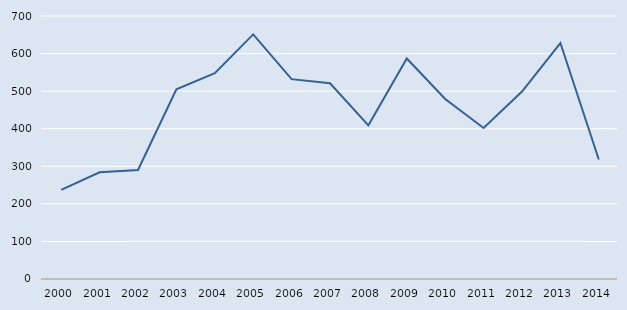
| Category | Series 0 |
|---|---|
| 2000.0 | 237 |
| 2001.0 | 284 |
| 2002.0 | 290 |
| 2003.0 | 505 |
| 2004.0 | 548 |
| 2005.0 | 651 |
| 2006.0 | 532 |
| 2007.0 | 521 |
| 2008.0 | 409 |
| 2009.0 | 587 |
| 2010.0 | 479 |
| 2011.0 | 402 |
| 2012.0 | 499 |
| 2013.0 | 628 |
| 2014.0 | 318 |